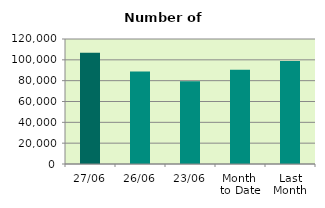
| Category | Series 0 |
|---|---|
| 27/06 | 106868 |
| 26/06 | 88878 |
| 23/06 | 79336 |
| Month 
to Date | 90559.158 |
| Last
Month | 98885.545 |